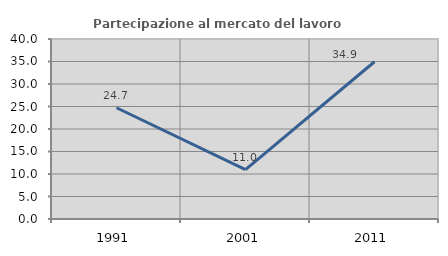
| Category | Partecipazione al mercato del lavoro  femminile |
|---|---|
| 1991.0 | 24.719 |
| 2001.0 | 10.989 |
| 2011.0 | 34.94 |